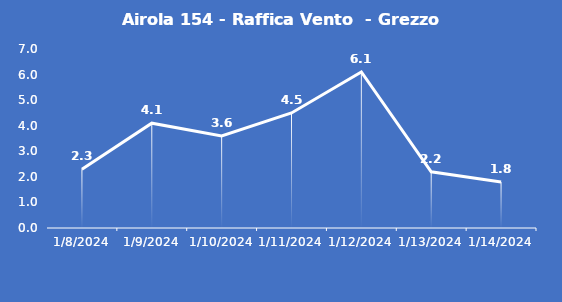
| Category | Airola 154 - Raffica Vento  - Grezzo (m/s) |
|---|---|
| 1/8/24 | 2.3 |
| 1/9/24 | 4.1 |
| 1/10/24 | 3.6 |
| 1/11/24 | 4.5 |
| 1/12/24 | 6.1 |
| 1/13/24 | 2.2 |
| 1/14/24 | 1.8 |